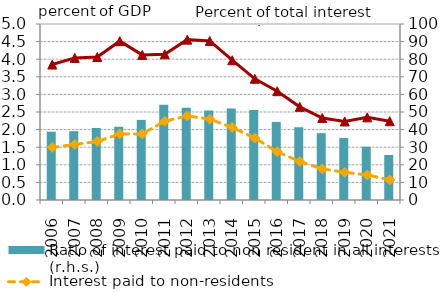
| Category | Ratio of interest paid to non resident in all interests (r.h.s.) |
|---|---|
| 2006.0 | 38.81 |
| 2007.0 | 39.109 |
| 2008.0 | 40.932 |
| 2009.0 | 41.598 |
| 2010.0 | 45.514 |
| 2011.0 | 54.073 |
| 2012.0 | 52.429 |
| 2013.0 | 50.814 |
| 2014.0 | 51.926 |
| 2015.0 | 51.086 |
| 2016.0 | 44.357 |
| 2017.0 | 41.339 |
| 2018.0 | 37.98 |
| 2019.0 | 35.246 |
| 2020.0 | 30.279 |
| 2021.0 | 25.553 |